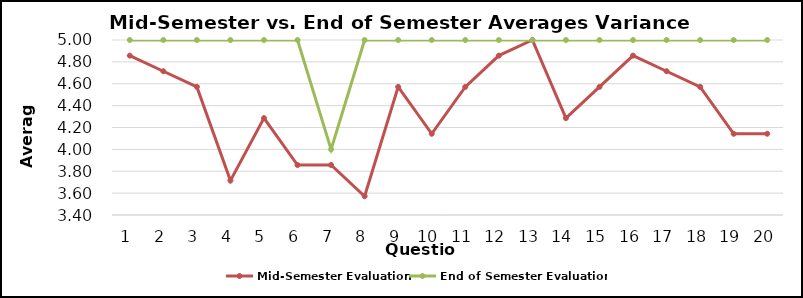
| Category | Mid-Semester Evaluation | End of Semester Evaluation |
|---|---|---|
| 0 | 4.857 | 5 |
| 1 | 4.714 | 5 |
| 2 | 4.571 | 5 |
| 3 | 3.714 | 5 |
| 4 | 4.286 | 5 |
| 5 | 3.857 | 5 |
| 6 | 3.857 | 4 |
| 7 | 3.571 | 5 |
| 8 | 4.571 | 5 |
| 9 | 4.143 | 5 |
| 10 | 4.571 | 5 |
| 11 | 4.857 | 5 |
| 12 | 5 | 5 |
| 13 | 4.286 | 5 |
| 14 | 4.571 | 5 |
| 15 | 4.857 | 5 |
| 16 | 4.714 | 5 |
| 17 | 4.571 | 5 |
| 18 | 4.143 | 5 |
| 19 | 4.143 | 5 |